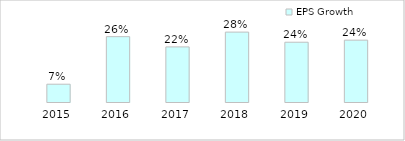
| Category | EPS Growth |
|---|---|
| 2015-03-31 | 0.07 |
| 2016-03-31 | 0.258 |
| 2017-03-31 | 0.218 |
| 2018-03-31 | 0.276 |
| 2019-03-31 | 0.236 |
| 2020-03-31 | 0.244 |